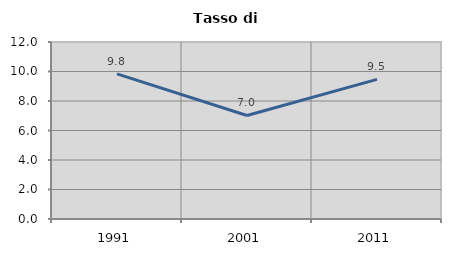
| Category | Tasso di disoccupazione   |
|---|---|
| 1991.0 | 9.84 |
| 2001.0 | 7.018 |
| 2011.0 | 9.469 |